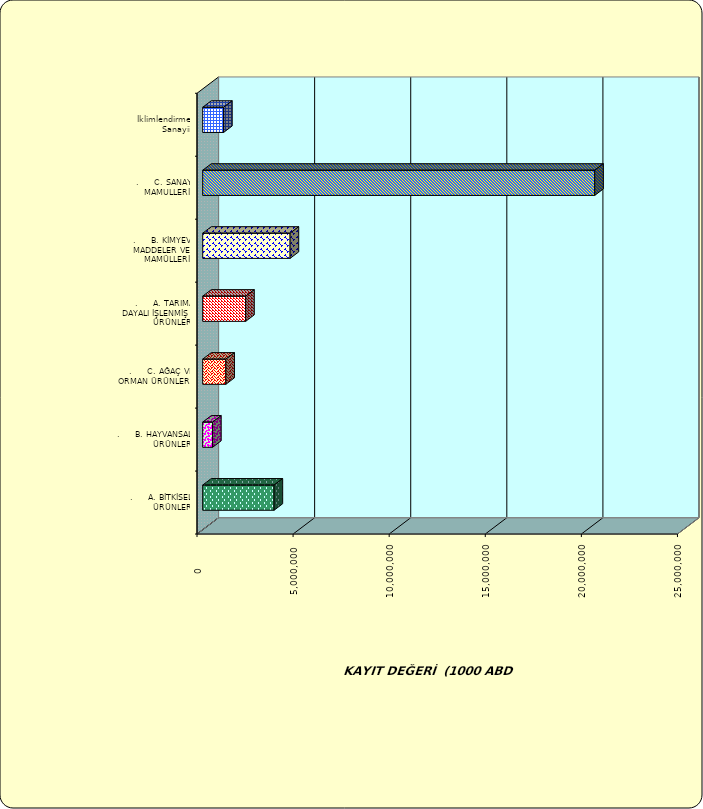
| Category | Series 0 |
|---|---|
| .     A. BİTKİSEL ÜRÜNLER | 3713874.738 |
| .     B. HAYVANSAL ÜRÜNLER | 515461.169 |
| .     C. AĞAÇ VE ORMAN ÜRÜNLERİ | 1204674.983 |
| .     A. TARIMA DAYALI İŞLENMİŞ ÜRÜNLER | 2236703.208 |
| .     B. KİMYEVİ MADDELER VE MAMÜLLERİ | 4548442.724 |
| .     C. SANAYİ MAMULLERİ | 20398900.438 |
|  İklimlendirme Sanayii | 1087927.309 |